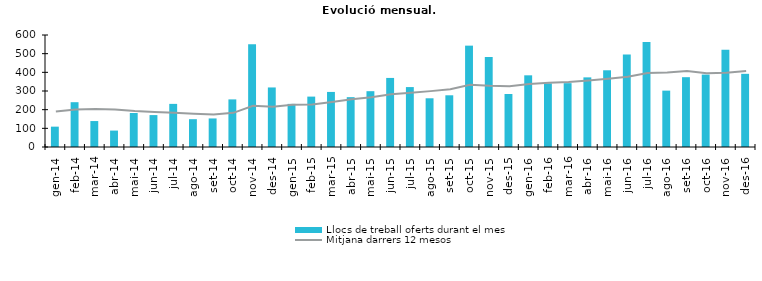
| Category | Llocs de treball oferts durant el mes |
|---|---|
| gen-14 | 109 |
| feb-14 | 240 |
| mar-14 | 139 |
| abr-14 | 88 |
| mai-14 | 182 |
| jun-14 | 171 |
| jul-14 | 231 |
| ago-14 | 149 |
| set-14 | 153 |
| oct-14 | 255 |
| nov-14 | 551 |
| des-14 | 319 |
| gen-15 | 231 |
| feb-15 | 270 |
| mar-15 | 295 |
| abr-15 | 267 |
| mai-15 | 299 |
| jun-15 | 370 |
| jul-15 | 321 |
| ago-15 | 261 |
| set-15 | 277 |
| oct-15 | 543 |
| nov-15 | 482 |
| des-15 | 284 |
| gen-16 | 384 |
| feb-16 | 341 |
| mar-16 | 342 |
| abr-16 | 373 |
| mai-16 | 411 |
| jun-16 | 495 |
| jul-16 | 562 |
| ago-16 | 302 |
| set-16 | 374 |
| oct-16 | 388 |
| nov-16 | 521 |
| des-16 | 392 |